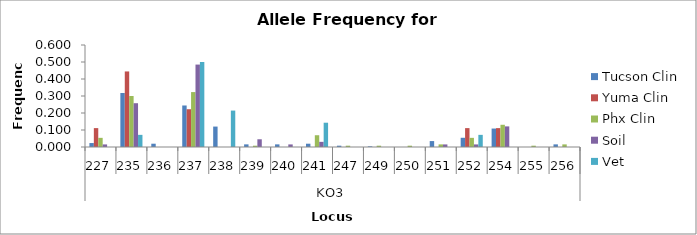
| Category | Tucson Clin | Yuma Clin | Phx Clin | Soil | Vet |
|---|---|---|---|---|---|
| 0 | 0.023 | 0.111 | 0.054 | 0.015 | 0 |
| 1 | 0.318 | 0.444 | 0.3 | 0.258 | 0.071 |
| 2 | 0.019 | 0 | 0 | 0 | 0 |
| 3 | 0.244 | 0.222 | 0.323 | 0.485 | 0.5 |
| 4 | 0.12 | 0 | 0 | 0 | 0.214 |
| 5 | 0.016 | 0 | 0.008 | 0.045 | 0 |
| 6 | 0.016 | 0 | 0 | 0.015 | 0 |
| 7 | 0.019 | 0 | 0.069 | 0.03 | 0.143 |
| 8 | 0.008 | 0 | 0.008 | 0 | 0 |
| 9 | 0.004 | 0 | 0.008 | 0 | 0 |
| 10 | 0 | 0 | 0.008 | 0 | 0 |
| 11 | 0.035 | 0 | 0.015 | 0.015 | 0 |
| 12 | 0.054 | 0.111 | 0.054 | 0.015 | 0.071 |
| 13 | 0.109 | 0.111 | 0.131 | 0.121 | 0 |
| 14 | 0 | 0 | 0.008 | 0 | 0 |
| 15 | 0.016 | 0 | 0.015 | 0 | 0 |